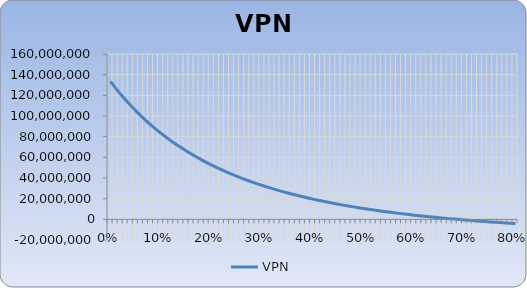
| Category | VPN |
|---|---|
| 0.0 | 133211916.485 |
| 0.01 | 126960814.264 |
| 0.02 | 121034666.157 |
| 0.03 | 115413305.249 |
| 0.04 | 110078010.258 |
| 0.05 | 105011388.555 |
| 0.06 | 100197269.694 |
| 0.07 | 95620608.419 |
| 0.08 | 91267396.217 |
| 0.09 | 87124580.598 |
| 0.1 | 83179991.355 |
| 0.11 | 79422273.151 |
| 0.12 | 75840823.82 |
| 0.13 | 72425737.878 |
| 0.14 | 69167754.727 |
| 0.15 | 66058211.157 |
| 0.16 | 63088997.731 |
| 0.17 | 60252518.712 |
| 0.18 | 57541655.224 |
| 0.19 | 54949731.346 |
| 0.2 | 52470482.894 |
| 0.21 | 50098028.646 |
| 0.22 | 47826843.818 |
| 0.23 | 45651735.573 |
| 0.24 | 43567820.411 |
| 0.25 | 41570503.277 |
| 0.26 | 39655458.237 |
| 0.27 | 37818610.594 |
| 0.28 | 36056120.338 |
| 0.29 | 34364366.803 |
| 0.3 | 32739934.446 |
| 0.31 | 31179599.653 |
| 0.32 | 29680318.493 |
| 0.33 | 28239215.342 |
| 0.34 | 26853572.312 |
| 0.35 | 25520819.419 |
| 0.36 | 24238525.437 |
| 0.37 | 23004389.382 |
| 0.38 | 21816232.581 |
| 0.39 | 20671991.277 |
| 0.4 | 19569709.737 |
| 0.41 | 18507533.821 |
| 0.42 | 17483704.974 |
| 0.43 | 16496554.623 |
| 0.44 | 15544498.935 |
| 0.45 | 14626033.917 |
| 0.46 | 13739730.836 |
| 0.47 | 12884231.928 |
| 0.48 | 12058246.385 |
| 0.49 | 11260546.591 |
| 0.5 | 10489964.602 |
| 0.51 | 9745388.834 |
| 0.52 | 9025760.971 |
| 0.53 | 8330073.047 |
| 0.54 | 7657364.723 |
| 0.55 | 7006720.714 |
| 0.56 | 6377268.384 |
| 0.57 | 5768175.472 |
| 0.58 | 5178647.969 |
| 0.59 | 4607928.107 |
| 0.6 | 4055292.471 |
| 0.61 | 3520050.223 |
| 0.62 | 3001541.428 |
| 0.63 | 2499135.473 |
| 0.64 | 2012229.58 |
| 0.65 | 1540247.406 |
| 0.66 | 1082637.714 |
| 0.67 | 638873.127 |
| 0.68 | 208448.944 |
| 0.69 | -209117.969 |
| 0.7 | -614290.235 |
| 0.71 | -1007510.963 |
| 0.72 | -1389204.688 |
| 0.73 | -1759778.258 |
| 0.74 | -2119621.682 |
| 0.75 | -2469108.924 |
| 0.76 | -2808598.659 |
| 0.77 | -3138434.987 |
| 0.78 | -3458948.113 |
| 0.79 | -3770454.987 |
| 0.8 | -4073259.913 |